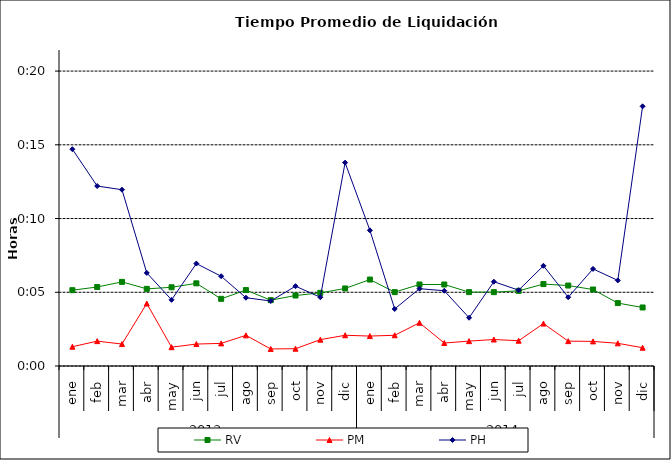
| Category | RV | PM | PH |
|---|---|---|---|
| 0 | 0.004 | 0.001 | 0.01 |
| 1 | 0.004 | 0.001 | 0.009 |
| 2 | 0.004 | 0.001 | 0.008 |
| 3 | 0.004 | 0.003 | 0.004 |
| 4 | 0.004 | 0.001 | 0.003 |
| 5 | 0.004 | 0.001 | 0.005 |
| 6 | 0.003 | 0.001 | 0.004 |
| 7 | 0.004 | 0.001 | 0.003 |
| 8 | 0.003 | 0.001 | 0.003 |
| 9 | 0.003 | 0.001 | 0.004 |
| 10 | 0.003 | 0.001 | 0.003 |
| 11 | 0.004 | 0.001 | 0.01 |
| 12 | 0.004 | 0.001 | 0.006 |
| 13 | 0.004 | 0.001 | 0.003 |
| 14 | 0.004 | 0.002 | 0.004 |
| 15 | 0.004 | 0.001 | 0.004 |
| 16 | 0.004 | 0.001 | 0.002 |
| 17 | 0.004 | 0.001 | 0.004 |
| 18 | 0.004 | 0.001 | 0.004 |
| 19 | 0.004 | 0.002 | 0.005 |
| 20 | 0.004 | 0.001 | 0.003 |
| 21 | 0.004 | 0.001 | 0.005 |
| 22 | 0.003 | 0.001 | 0.004 |
| 23 | 0.003 | 0.001 | 0.012 |